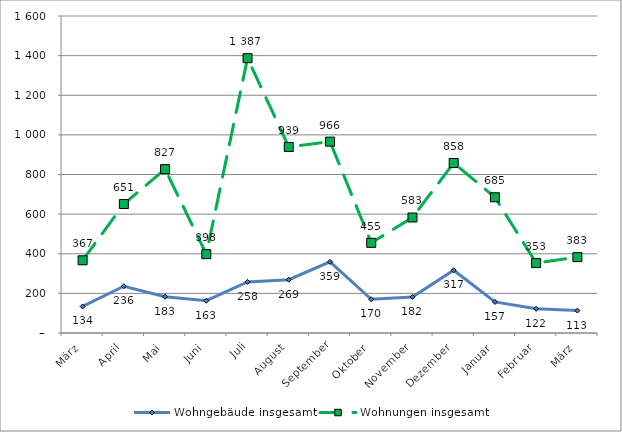
| Category | Wohngebäude insgesamt | Wohnungen insgesamt |
|---|---|---|
| März | 134 | 367 |
| April | 236 | 651 |
| Mai | 183 | 827 |
| Juni | 163 | 398 |
| Juli | 258 | 1387 |
| August | 269 | 939 |
| September | 359 | 966 |
| Oktober | 170 | 455 |
| November | 182 | 583 |
| Dezember | 317 | 858 |
| Januar | 157 | 685 |
| Februar | 122 | 353 |
| März | 113 | 383 |